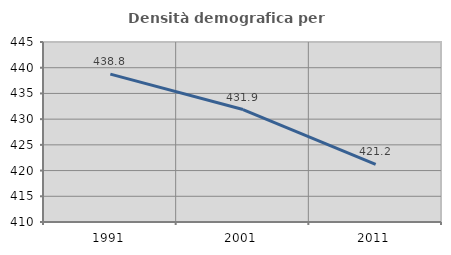
| Category | Densità demografica |
|---|---|
| 1991.0 | 438.762 |
| 2001.0 | 431.863 |
| 2011.0 | 421.191 |